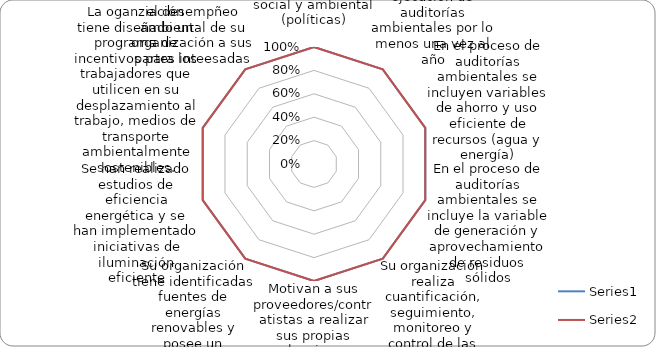
| Category | Series 0 | Series 1 |
|---|---|---|
| Su organización socializa, capacita y forma a sus trabajadores en todo lo relacionado con su misión social y ambiental (políticas) | 1 | 1 |
| Su organización promueve la ejecución de auditorías ambientales por lo menos una vez al año | 1 | 1 |
| En el proceso de auditorías ambientales se incluyen variables de ahorro y uso eficiente de recursos (agua y energía) | 1 | 1 |
| En el proceso de auditorías ambientales se incluye la variable de generación y aprovechamiento de residuos sólidos | 1 | 1 |
| Su organización realiza cuantificación, seguimiento, monitoreo y control de las emisiones de gases de efecto invernadero (inventario GEI, medición de la huella de carbono, programas de mititgación y adaptación al cambio climático, etc.) | 1 | 1 |
| Motivan a sus proveedores/contratistas a realizar sus propias evaluaciones y auditorías ambientales en relación con el uso de electricidad y agua, generación de desechos, emisiones de gases de efecto invernadero y empleo de energías renovables. | 1 | 1 |
| Su organización tiene identificadas fuentes de energías renovables y posee un cronograma de adopción e implementación gradual de estas en su operación  | 1 | 1 |
| Se han realizado estudios de eficiencia energética y se han implementado iniciativas de iluminación eficiente | 1 | 1 |
| La oganziación tiene diseñado un programa de incentivos para los trabajadores que utilicen en su desplazamiento al trabajo, medios de transporte ambientalmente sostenibles. | 1 | 1 |
| Existe un procedimiento de rendición de cuentas que de información sobre el desempñeo ambiental de su organización a sus partes inteesadas | 1 | 1 |